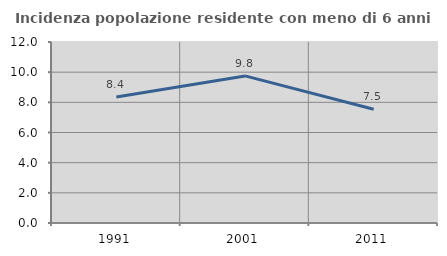
| Category | Incidenza popolazione residente con meno di 6 anni |
|---|---|
| 1991.0 | 8.359 |
| 2001.0 | 9.752 |
| 2011.0 | 7.546 |